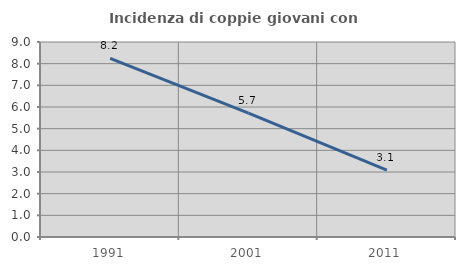
| Category | Incidenza di coppie giovani con figli |
|---|---|
| 1991.0 | 8.247 |
| 2001.0 | 5.714 |
| 2011.0 | 3.086 |